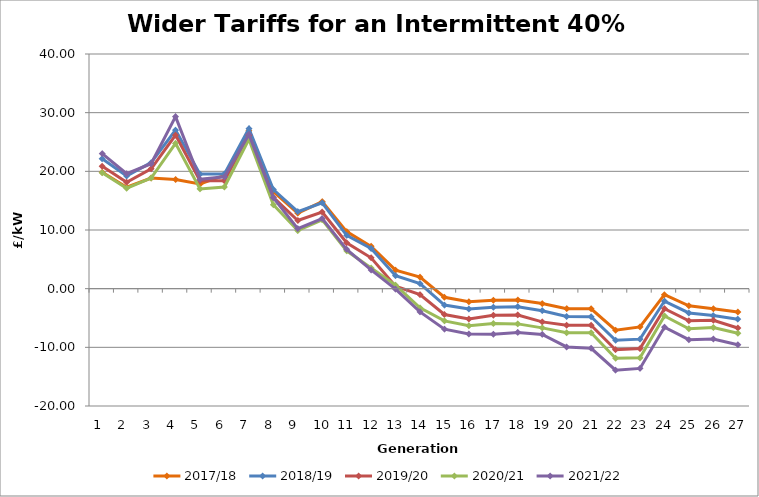
| Category | 2017/18 | 2018/19 | 2019/20 | 2020/21 | 2021/22 |
|---|---|---|---|---|---|
| 1.0 | 19.832 | 22.144 | 20.866 | 19.759 | 23.023 |
| 2.0 | 17.287 | 19.215 | 18.136 | 17.125 | 19.602 |
| 3.0 | 18.858 | 21.474 | 20.437 | 18.852 | 21.293 |
| 4.0 | 18.601 | 27.035 | 26.167 | 24.768 | 29.324 |
| 5.0 | 17.835 | 19.525 | 18.385 | 16.996 | 18.643 |
| 6.0 | 19.311 | 19.539 | 18.395 | 17.335 | 19.06 |
| 7.0 | 26.902 | 27.281 | 26.156 | 25.477 | 26.283 |
| 8.0 | 16.541 | 16.905 | 15.56 | 14.302 | 15.512 |
| 9.0 | 12.865 | 13.118 | 11.619 | 9.903 | 10.24 |
| 10.0 | 14.834 | 14.624 | 13.065 | 11.745 | 11.958 |
| 11.0 | 9.718 | 9.087 | 7.821 | 6.447 | 6.704 |
| 12.0 | 7.215 | 6.84 | 5.264 | 3.52 | 3.193 |
| 13.0 | 3.162 | 2.212 | 0.424 | 0.601 | -0.068 |
| 14.0 | 1.973 | 0.879 | -1.021 | -3.265 | -3.953 |
| 15.0 | -1.462 | -2.795 | -4.401 | -5.489 | -6.896 |
| 16.0 | -2.234 | -3.473 | -5.171 | -6.328 | -7.74 |
| 17.0 | -1.988 | -3.158 | -4.524 | -5.927 | -7.758 |
| 18.0 | -1.933 | -3.075 | -4.478 | -6.002 | -7.453 |
| 19.0 | -2.536 | -3.755 | -5.663 | -6.68 | -7.808 |
| 20.0 | -3.408 | -4.751 | -6.241 | -7.525 | -9.932 |
| 21.0 | -3.432 | -4.77 | -6.223 | -7.527 | -10.162 |
| 22.0 | -7.084 | -8.793 | -10.402 | -11.853 | -13.893 |
| 23.0 | -6.514 | -8.605 | -10.201 | -11.79 | -13.592 |
| 24.0 | -1.028 | -2.113 | -3.412 | -4.644 | -6.56 |
| 25.0 | -2.921 | -4.141 | -5.475 | -6.835 | -8.691 |
| 26.0 | -3.423 | -4.592 | -5.389 | -6.609 | -8.578 |
| 27.0 | -3.975 | -5.197 | -6.708 | -7.595 | -9.56 |